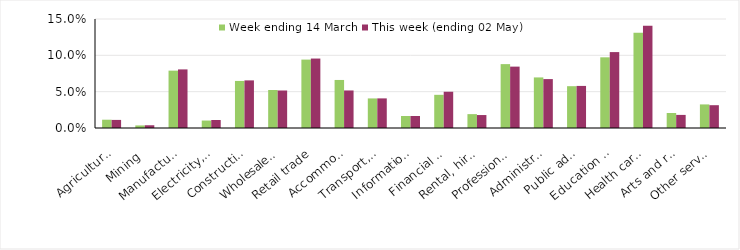
| Category | Week ending 14 March | This week (ending 02 May) |
|---|---|---|
| Agriculture, forestry and fishing | 0.011 | 0.011 |
| Mining | 0.004 | 0.004 |
| Manufacturing | 0.079 | 0.081 |
| Electricity, gas, water and waste services | 0.01 | 0.011 |
| Construction | 0.065 | 0.066 |
| Wholesale trade | 0.052 | 0.052 |
| Retail trade | 0.094 | 0.096 |
| Accommodation and food services | 0.066 | 0.052 |
| Transport, postal and warehousing | 0.041 | 0.041 |
| Information media and telecommunications | 0.017 | 0.017 |
| Financial and insurance services | 0.046 | 0.05 |
| Rental, hiring and real estate services | 0.019 | 0.018 |
| Professional, scientific and technical services | 0.088 | 0.084 |
| Administrative and support services | 0.07 | 0.067 |
| Public administration and safety | 0.058 | 0.058 |
| Education and training | 0.097 | 0.104 |
| Health care and social assistance | 0.131 | 0.141 |
| Arts and recreation services | 0.021 | 0.018 |
| Other services | 0.032 | 0.031 |